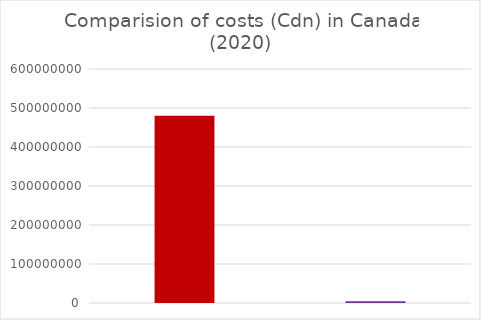
| Category | BC, Canada |
|---|---|
| 0 | 480000000 |
| 1 | 4704000 |